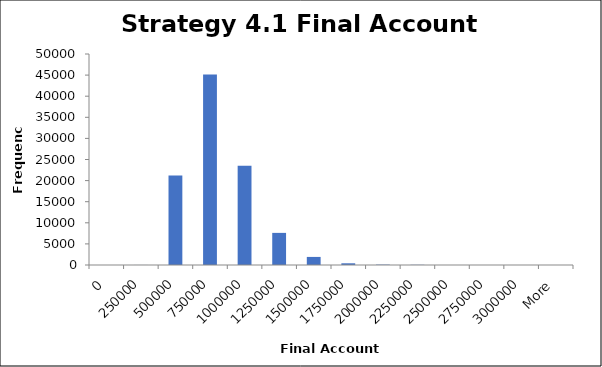
| Category | Frequency |
|---|---|
| 0 | 0 |
| 250000 | 10 |
| 500000 | 21229 |
| 750000 | 45164 |
| 1000000 | 23539 |
| 1250000 | 7610 |
| 1500000 | 1914 |
| 1750000 | 405 |
| 2000000 | 85 |
| 2250000 | 45 |
| 2500000 | 0 |
| 2750000 | 0 |
| 3000000 | 0 |
| More | 1 |